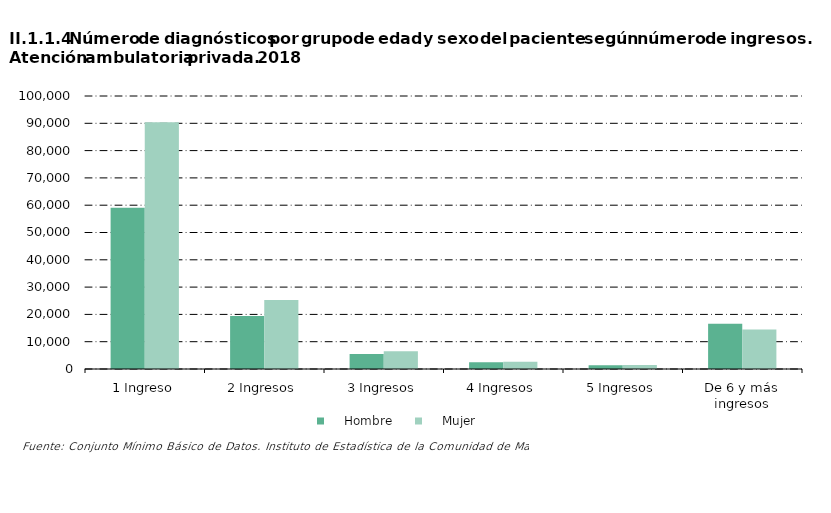
| Category |     Hombre |     Mujer |
|---|---|---|
| 1 Ingreso | 59035 | 90422 |
| 2 Ingresos | 19378 | 25281 |
| 3 Ingresos | 5502 | 6482 |
| 4 Ingresos | 2484 | 2611 |
| 5 Ingresos | 1383 | 1428 |
| De 6 y más ingresos | 16609 | 14487 |